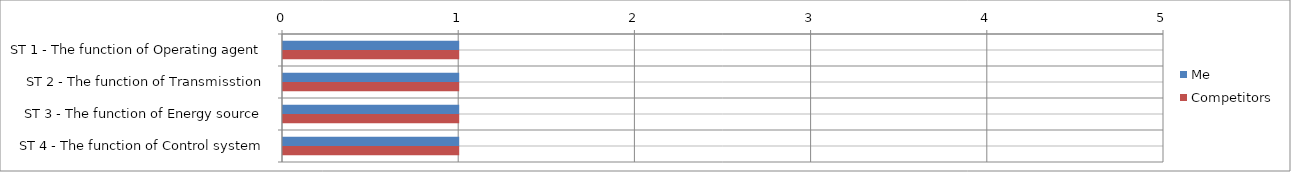
| Category | Me | Competitors |
|---|---|---|
| ST 1 - The function of Operating agent | 1 | 1 |
| ST 2 - The function of Transmisstion | 1 | 1 |
| ST 3 - The function of Energy source | 1 | 1 |
| ST 4 - The function of Control system | 1 | 1 |